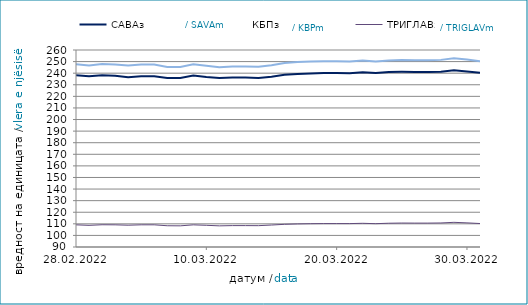
| Category | САВАз | КБПз | ТРИГЛАВз |
|---|---|---|---|
| 2022-02-28 | 238.268 | 247.766 | 109.123 |
| 2022-03-01 | 237.26 | 246.605 | 108.681 |
| 2022-03-02 | 238.244 | 247.831 | 109.193 |
| 2022-03-03 | 237.751 | 247.508 | 109.125 |
| 2022-03-04 | 236.589 | 246.596 | 108.803 |
| 2022-03-05 | 237.356 | 247.486 | 109.139 |
| 2022-03-06 | 237.368 | 247.499 | 109.143 |
| 2022-03-07 | 235.8 | 245.38 | 108.349 |
| 2022-03-08 | 235.896 | 245.388 | 108.266 |
| 2022-03-09 | 238.068 | 247.673 | 109.111 |
| 2022-03-10 | 236.772 | 246.419 | 108.723 |
| 2022-03-11 | 235.78 | 245.113 | 108.244 |
| 2022-03-12 | 236.25 | 245.674 | 108.462 |
| 2022-03-13 | 236.262 | 245.688 | 108.465 |
| 2022-03-14 | 235.814 | 245.572 | 108.418 |
| 2022-03-15 | 236.917 | 246.914 | 108.945 |
| 2022-03-16 | 238.651 | 248.868 | 109.573 |
| 2022-03-17 | 239.331 | 249.578 | 109.91 |
| 2022-03-18 | 239.814 | 250.075 | 110.097 |
| 2022-03-19 | 240.058 | 250.357 | 110.202 |
| 2022-03-20 | 240.07 | 250.37 | 110.205 |
| 2022-03-21 | 239.925 | 250.143 | 110.188 |
| 2022-03-22 | 240.8 | 250.947 | 110.454 |
| 2022-03-23 | 240.204 | 250.069 | 110.117 |
| 2022-03-24 | 241.061 | 250.998 | 110.519 |
| 2022-03-25 | 241.16 | 251.276 | 110.679 |
| 2022-03-26 | 241.053 | 251.137 | 110.622 |
| 2022-03-27 | 241.065 | 251.15 | 110.626 |
| 2022-03-28 | 241.181 | 251.479 | 110.748 |
| 2022-03-29 | 242.502 | 252.908 | 111.288 |
| 2022-03-30 | 241.376 | 251.723 | 110.831 |
| 2022-03-31 | 240.312 | 250.362 | 110.26 |